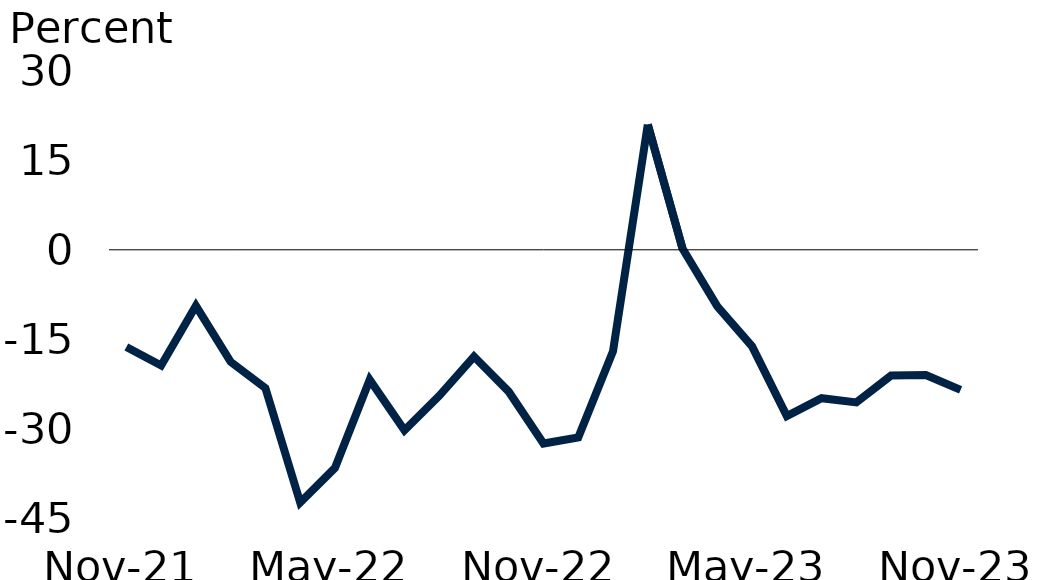
| Category | Series 0 |
|---|---|
| 2021-11-30 | -16.3 |
| 2021-12-31 | -19.4 |
| 2022-01-31 | -9.4 |
| 2022-02-28 | -18.8 |
| 2022-03-31 | -23.2 |
| 2022-04-30 | -42.4 |
| 2022-05-31 | -36.6 |
| 2022-06-30 | -21.8 |
| 2022-07-31 | -30.3 |
| 2022-08-31 | -24.5 |
| 2022-09-30 | -17.9 |
| 2022-10-31 | -23.8 |
| 2022-11-30 | -32.5 |
| 2022-12-31 | -31.5 |
| 2023-01-31 | -17 |
| 2023-02-28 | 21 |
| 2023-03-31 | 0.2 |
| 2023-04-30 | -9.5 |
| 2023-05-31 | -16.2 |
| 2023-06-30 | -27.9 |
| 2023-07-31 | -24.9 |
| 2023-08-31 | -25.6 |
| 2023-09-30 | -21.1 |
| 2023-10-31 | -21 |
| 2023-11-30 | -23.5 |